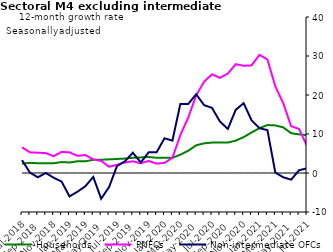
| Category | zero | Households | PNFCs | Non-intermediate OFCs |
|---|---|---|---|---|
| Mar-2018 | 0 | 2.5 | 6.2 | 7.2 |
| Apr-2018 | 0 | 2 | 6.4 | 5.2 |
| May-2018 | 0 | 2.6 | 6.4 | 7.6 |
| Jun-2018 | 0 | 2.5 | 5.4 | 5.4 |
| Jul-2018 | 0 | 2.4 | 6.5 | 3.4 |
| Aug-2018 | 0 | 2.6 | 5.3 | 0.1 |
| Sep-2018 | 0 | 2.5 | 5.2 | -1.1 |
| Oct-2018 | 0 | 2.5 | 5.1 | 0.1 |
| Nov-2018 | 0 | 2.4 | 4.3 | -1.2 |
| Dec-2018 | 0 | 2.8 | 5.4 | -2.1 |
| Jan-2019 | 0 | 2.7 | 5.3 | -6 |
| Feb-2019 | 0 | 3 | 4.4 | -4.8 |
| Mar-2019 | 0 | 3 | 4.6 | -3.4 |
| Apr-2019 | 0 | 3.5 | 3.5 | -1.1 |
| May-2019 | 0 | 3.4 | 3.1 | -6.8 |
| Jun-2019 | 0 | 3.5 | 1.6 | -3.7 |
| Jul-2019 | 0 | 3.6 | 2.1 | 1.9 |
| Aug-2019 | 0 | 3.7 | 2.6 | 3.1 |
| Sep-2019 | 0 | 3.9 | 3 | 5.3 |
| Oct-2019 | 0 | 3.9 | 2.5 | 2.8 |
| Nov-2019 | 0 | 4.1 | 3 | 5.3 |
| Dec-2019 | 0 | 3.9 | 2.4 | 5.3 |
| Jan-2020 | 0 | 3.9 | 2.6 | 9 |
| Feb-2020 | 0 | 3.9 | 3.9 | 8.3 |
| Mar-2020 | 0 | 4.8 | 9.7 | 17.7 |
| Apr-2020 | 0 | 5.7 | 14.2 | 17.6 |
| May-2020 | 0 | 7.1 | 19.8 | 20 |
| Jun-2020 | 0 | 7.6 | 23.4 | 17.4 |
| Jul-2020 | 0 | 7.8 | 25.2 | 16.8 |
| Aug-2020 | 0 | 7.7 | 24.4 | 13.2 |
| Sep-2020 | 0 | 7.8 | 25.5 | 11.4 |
| Oct-2020 | 0 | 8.3 | 27.8 | 16.2 |
| Nov-2020 | 0 | 9.2 | 27.5 | 17.9 |
| Dec-2020 | 0 | 10.4 | 27.6 | 13.6 |
| Jan-2021 | 0 | 11.5 | 30.3 | 11.5 |
| Feb-2021 | 0 | 12.3 | 29.2 | 11 |
| Mar-2021 | 0 | 12.3 | 22.3 | 0.1 |